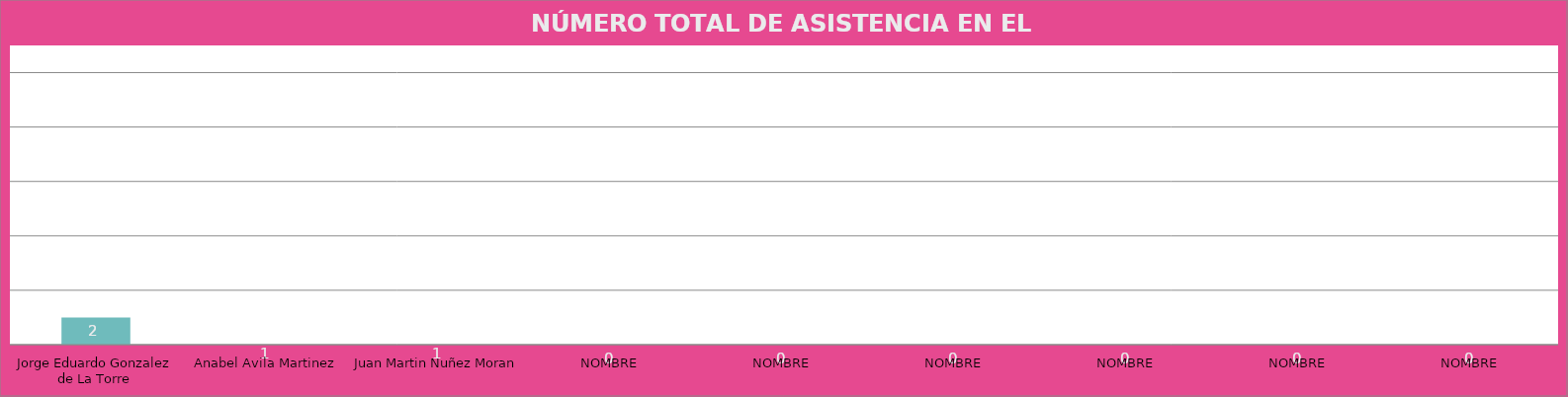
| Category | Jorge Eduardo Gonzalez de La Torre |
|---|---|
| Jorge Eduardo Gonzalez de La Torre | 2 |
| Anabel Avila Martinez | 1 |
| Juan Martin Nuñez Moran | 1 |
| NOMBRE | 0 |
| NOMBRE | 0 |
| NOMBRE | 0 |
| NOMBRE | 0 |
| NOMBRE | 0 |
| NOMBRE | 0 |